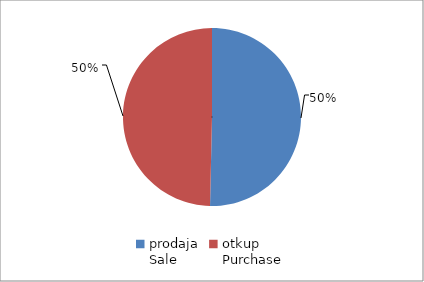
| Category | Series 0 |
|---|---|
| prodaja
Sale | 15142361 |
| otkup
Purchase | 14929896 |